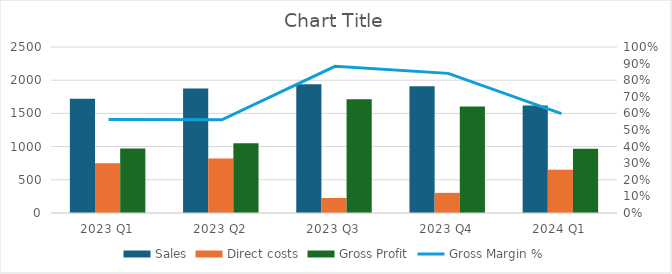
| Category | Sales | Direct costs | Gross Profit |
|---|---|---|---|
| 2023 Q1 | 1721 | 751 | 970 |
| 2023 Q2 | 1874 | 822 | 1052 |
| 2023 Q3 | 1939 | 226 | 1713 |
| 2023 Q4 | 1908 | 303 | 1605 |
| 2024 Q1 | 1620 | 651 | 969 |